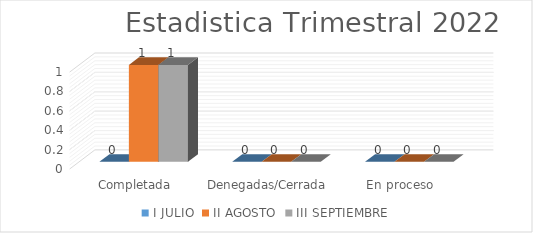
| Category | I | II | III |
|---|---|---|---|
| Completada | 0 | 1 | 1 |
| Denegadas/Cerrada | 0 | 0 | 0 |
| En proceso | 0 | 0 | 0 |